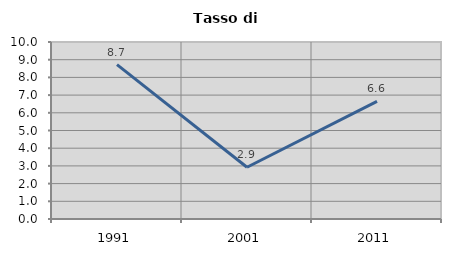
| Category | Tasso di disoccupazione   |
|---|---|
| 1991.0 | 8.722 |
| 2001.0 | 2.923 |
| 2011.0 | 6.641 |